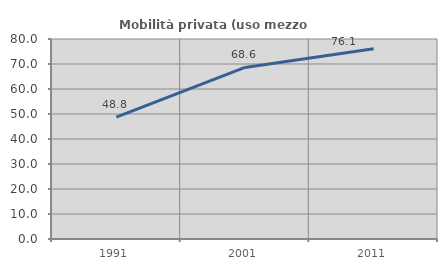
| Category | Mobilità privata (uso mezzo privato) |
|---|---|
| 1991.0 | 48.754 |
| 2001.0 | 68.636 |
| 2011.0 | 76.087 |